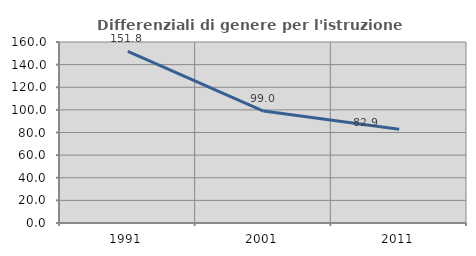
| Category | Differenziali di genere per l'istruzione superiore |
|---|---|
| 1991.0 | 151.751 |
| 2001.0 | 98.977 |
| 2011.0 | 82.938 |